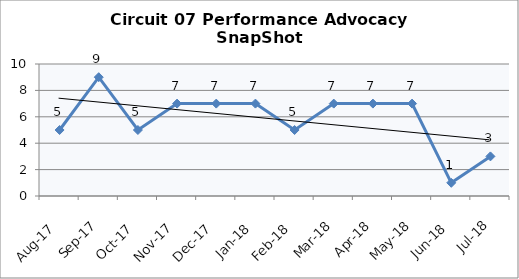
| Category | Circuit 07 |
|---|---|
| Aug-17 | 5 |
| Sep-17 | 9 |
| Oct-17 | 5 |
| Nov-17 | 7 |
| Dec-17 | 7 |
| Jan-18 | 7 |
| Feb-18 | 5 |
| Mar-18 | 7 |
| Apr-18 | 7 |
| May-18 | 7 |
| Jun-18 | 1 |
| Jul-18 | 3 |